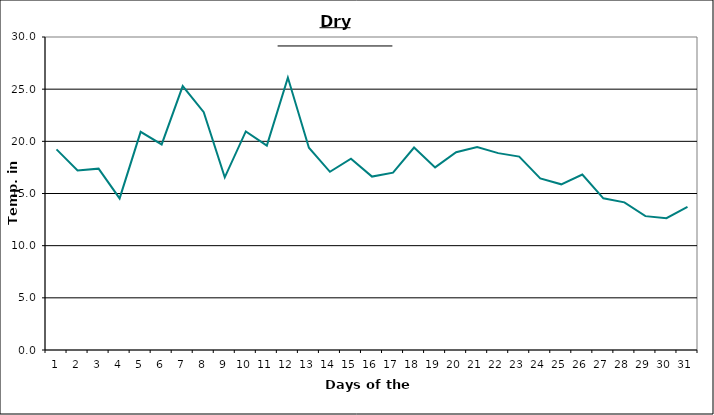
| Category | Series 0 |
|---|---|
| 0 | 19.23 |
| 1 | 17.2 |
| 2 | 17.38 |
| 3 | 14.53 |
| 4 | 20.91 |
| 5 | 19.7 |
| 6 | 25.3 |
| 7 | 22.8 |
| 8 | 16.55 |
| 9 | 20.95 |
| 10 | 19.59 |
| 11 | 26.11 |
| 12 | 19.39 |
| 13 | 17.08 |
| 14 | 18.34 |
| 15 | 16.62 |
| 16 | 17 |
| 17 | 19.41 |
| 18 | 17.5 |
| 19 | 18.95 |
| 20 | 19.46 |
| 21 | 18.87 |
| 22 | 18.54 |
| 23 | 16.44 |
| 24 | 15.88 |
| 25 | 16.82 |
| 26 | 14.54 |
| 27 | 14.15 |
| 28 | 12.83 |
| 29 | 12.63 |
| 30 | 13.71 |